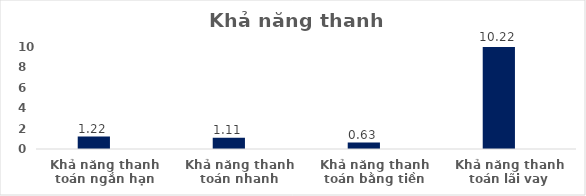
| Category | Series 0 | Series 1 | Series 2 | Series 3 | Series 4 | Series 5 |
|---|---|---|---|---|---|---|
| Khả năng thanh toán ngắn hạn | 0 | 1.218 |  |  |  |  |
| Khả năng thanh toán nhanh | 0 | 1.11 |  |  |  |  |
| Khả năng thanh toán bằng tiền | 0 | 0.628 |  |  |  |  |
| Khả năng thanh toán lãi vay | 0 | 10.222 |  |  |  |  |